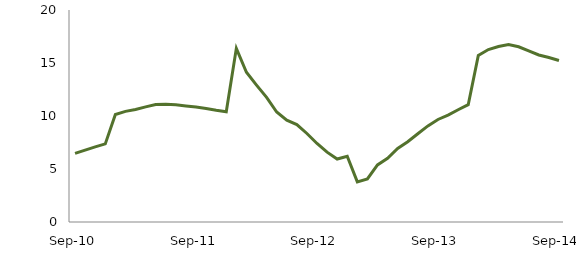
| Category | Series 0 |
|---|---|
| Sep-10 | 6.472 |
|  | 6.786 |
|  | 7.082 |
|  | 7.369 |
|  | 10.146 |
|  | 10.438 |
|  | 10.611 |
|  | 10.862 |
|  | 11.089 |
|  | 11.108 |
|  | 11.056 |
|  | 10.952 |
| Sep-11 | 10.857 |
|  | 10.717 |
|  | 10.538 |
|  | 10.395 |
|  | 16.386 |
|  | 14.123 |
|  | 12.918 |
|  | 11.755 |
|  | 10.374 |
|  | 9.606 |
|  | 9.195 |
|  | 8.349 |
| Sep-12 | 7.408 |
|  | 6.592 |
|  | 5.938 |
|  | 6.204 |
|  | 3.789 |
|  | 4.058 |
|  | 5.388 |
|  | 6.01 |
|  | 6.935 |
|  | 7.567 |
|  | 8.326 |
|  | 9.065 |
| Sep-13 | 9.672 |
|  | 10.081 |
|  | 10.588 |
|  | 11.067 |
|  | 15.71 |
|  | 16.267 |
|  | 16.561 |
|  | 16.745 |
|  | 16.528 |
|  | 16.143 |
|  | 15.755 |
|  | 15.512 |
| Sep-14 | 15.232 |